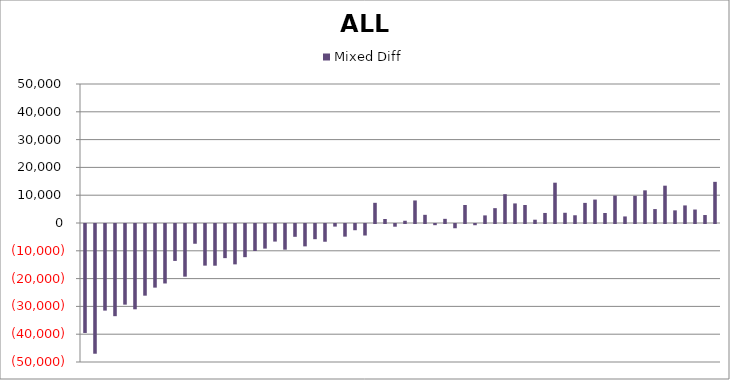
| Category | Mixed Diff |
|---|---|
| 0 | -39194.43 |
| 1 | -46664.622 |
| 2 | -31157.233 |
| 3 | -33156.345 |
| 4 | -29006.361 |
| 5 | -30679.601 |
| 6 | -25780.225 |
| 7 | -22888.77 |
| 8 | -21394.887 |
| 9 | -13279.836 |
| 10 | -18943.803 |
| 11 | -7104.084 |
| 12 | -14975.771 |
| 13 | -15004.367 |
| 14 | -12277.295 |
| 15 | -14518.716 |
| 16 | -11930.682 |
| 17 | -9711.049 |
| 18 | -8852.101 |
| 19 | -6322.72 |
| 20 | -9235.114 |
| 21 | -4607.952 |
| 22 | -8046.131 |
| 23 | -5464.75 |
| 24 | -6379.879 |
| 25 | -935.936 |
| 26 | -4549.524 |
| 27 | -2239.606 |
| 28 | -4140.031 |
| 29 | 7260.447 |
| 30 | 1440.033 |
| 31 | -972.654 |
| 32 | 813.844 |
| 33 | 8106.602 |
| 34 | 2940.701 |
| 35 | -424.2 |
| 36 | 1498.75 |
| 37 | -1528.45 |
| 38 | 6475.64 |
| 39 | -438.732 |
| 40 | 2734.023 |
| 41 | 5343.006 |
| 42 | 10359.528 |
| 43 | 7040.904 |
| 44 | 6467.804 |
| 45 | 1183.612 |
| 46 | 3613.04 |
| 47 | 14499.146 |
| 48 | 3679.728 |
| 49 | 2782.292 |
| 50 | 7233.487 |
| 51 | 8425.91 |
| 52 | 3600.039 |
| 53 | 9845.362 |
| 54 | 2360.839 |
| 55 | 9775 |
| 56 | 11746 |
| 57 | 5010 |
| 58 | 13425 |
| 59 | 4547 |
| 60 | 6322 |
| 61 | 4843 |
| 62 | 2867 |
| 63 | 14806 |